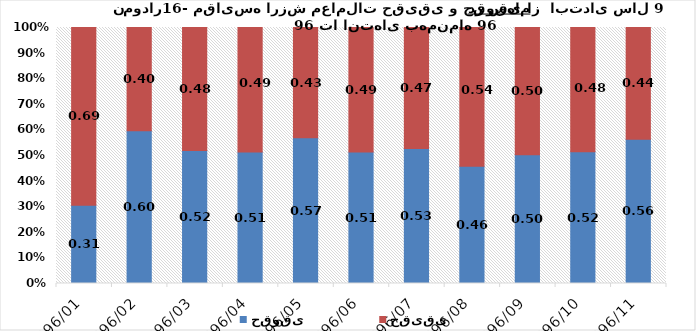
| Category | حقوقی | حقیقی |
|---|---|---|
| 1396/01 | 0.305 | 0.695 |
| 1396/02 | 0.596 | 0.404 |
| 1396/03 | 0.52 | 0.48 |
| 1396/04 | 0.514 | 0.486 |
| 1396/05 | 0.569 | 0.431 |
| 1396/06 | 0.514 | 0.486 |
| 1396/07 | 0.527 | 0.473 |
| 1396/08 | 0.458 | 0.542 |
| 1396/09 | 0.503 | 0.497 |
| 1396/10 | 0.515 | 0.485 |
| 1396/11 | 0.563 | 0.437 |